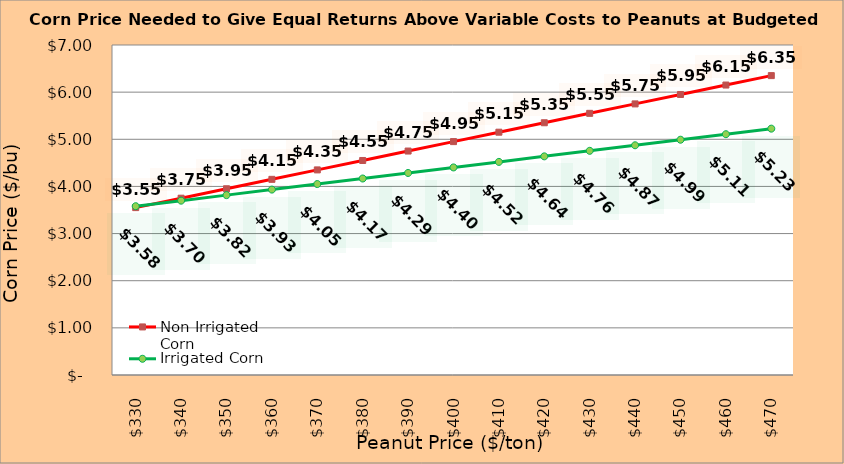
| Category | Non Irrigated Corn | Irrigated Corn |
|---|---|---|
| 330.0 | 3.551 | 3.58 |
| 340.0 | 3.751 | 3.698 |
| 350.0 | 3.951 | 3.815 |
| 360.0 | 4.151 | 3.933 |
| 370.0 | 4.351 | 4.05 |
| 380.0 | 4.551 | 4.168 |
| 390.0 | 4.751 | 4.285 |
| 400.0 | 4.951 | 4.403 |
| 410.0 | 5.151 | 4.52 |
| 420.0 | 5.351 | 4.638 |
| 430.0 | 5.551 | 4.755 |
| 440.0 | 5.751 | 4.873 |
| 450.0 | 5.951 | 4.99 |
| 460.0 | 6.151 | 5.108 |
| 470.0 | 6.351 | 5.225 |